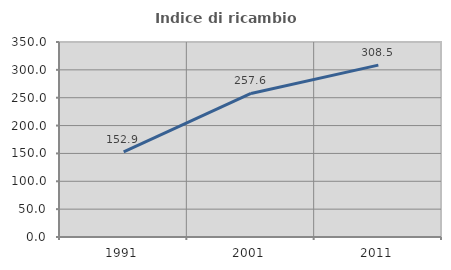
| Category | Indice di ricambio occupazionale  |
|---|---|
| 1991.0 | 152.86 |
| 2001.0 | 257.6 |
| 2011.0 | 308.494 |